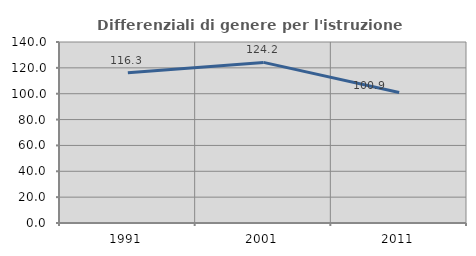
| Category | Differenziali di genere per l'istruzione superiore |
|---|---|
| 1991.0 | 116.261 |
| 2001.0 | 124.23 |
| 2011.0 | 100.939 |